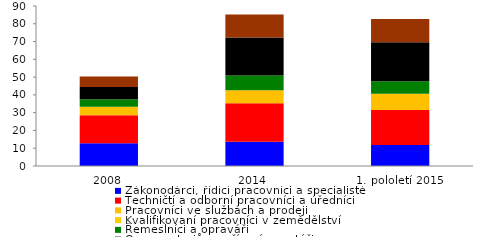
| Category | Zákonodárci, řídící pracovníci a specialisté | Techničtí a odborní pracovníci a úředníci | Pracovníci ve službách a prodeji | Kvalifikovaní pracovníci v zemědělství | Řemeslníci a opraváři | Oprava strojů a zařízení, montéři | Pomocní a nekvalifikovaní pracovníci |
|---|---|---|---|---|---|---|---|
| 2008 | 12.727 | 15.799 | 4.795 | 0.023 | 4.191 | 6.933 | 5.899 |
| 2014 | 13.705 | 21.643 | 7.202 | 0.006 | 8.361 | 21.375 | 12.975 |
| 1. pololetí 2015 | 11.75 | 19.753 | 9.101 | 0.007 | 6.991 | 22.011 | 13.12 |